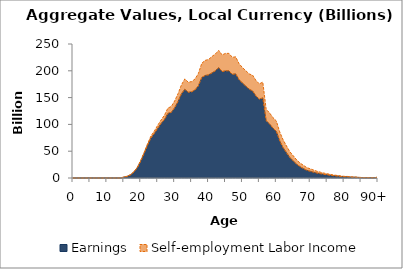
| Category | Earnings | Self-employment Labor Income |
|---|---|---|
| 0 | 0 | 0 |
|  | 0 | 0 |
| 2 | 0 | 0 |
| 3 | 0 | 0 |
| 4 | 0 | 0 |
| 5 | 0 | 0 |
| 6 | 0 | 0 |
| 7 | 0 | 0 |
| 8 | 0 | 0 |
| 9 | 0 | 0 |
| 10 | 0 | 0 |
| 11 | 0 | 0 |
| 12 | 0 | 0 |
| 13 | 0 | 0 |
| 14 | 0 | 0 |
| 15 | 1618.342 | 218.24 |
| 16 | 3059.624 | 309.433 |
| 17 | 5889.414 | 445.98 |
| 18 | 11230.916 | 643.451 |
| 19 | 19427.998 | 907.563 |
| 20 | 31693.841 | 1327.071 |
| 21 | 46060.813 | 1864.875 |
| 22 | 61195.367 | 2564.497 |
| 23 | 74717.393 | 3521.505 |
| 24 | 82914.275 | 4682.553 |
| 25 | 92669.138 | 5724.425 |
| 26 | 101815.867 | 6456.386 |
| 27 | 109250.815 | 8007.313 |
| 28 | 120593.2 | 9794.211 |
| 29 | 122427.278 | 10993.155 |
| 30 | 131002.43 | 12770.02 |
| 31 | 142847.174 | 14493.1 |
| 32 | 157217.451 | 16555.685 |
| 33 | 165664.427 | 19235.634 |
| 34 | 159937.778 | 18837.987 |
| 35 | 160653.683 | 19165.708 |
| 36 | 164166.934 | 20488.446 |
| 37 | 171979.604 | 22964.89 |
| 38 | 187545.929 | 26499.419 |
| 39 | 191251.602 | 28178.516 |
| 40 | 192373.236 | 28723.092 |
| 41 | 195984.248 | 30610.496 |
| 42 | 199903.014 | 31474.63 |
| 43 | 206010.977 | 32010.897 |
| 44 | 198551.921 | 31113.857 |
| 45 | 199830.768 | 32638.922 |
| 46 | 200021.409 | 32498.626 |
| 47 | 193367.714 | 31888.043 |
| 48 | 194332.802 | 31678.583 |
| 49 | 183491.693 | 29798.911 |
| 50 | 177111.476 | 28960.317 |
| 51 | 171421.255 | 28699.985 |
| 52 | 165705.131 | 28456.369 |
| 53 | 162338.494 | 29378.35 |
| 54 | 152877.015 | 29010.795 |
| 55 | 146960.652 | 28627.605 |
| 56 | 149471.912 | 29479.679 |
| 57 | 106850.737 | 21305.702 |
| 58 | 100864.652 | 20649.227 |
| 59 | 93059.924 | 19578.811 |
| 60 | 87096.947 | 19359.068 |
| 61 | 69318.752 | 16590.511 |
| 62 | 56595.117 | 14600.062 |
| 63 | 47340.378 | 12437.438 |
| 64 | 37965.557 | 11044.531 |
| 65 | 31903.446 | 9500.255 |
| 66 | 25730.141 | 8028.818 |
| 67 | 21108.636 | 6782.199 |
| 68 | 17584.874 | 6104.28 |
| 69 | 14284.533 | 5103.904 |
| 70 | 12574.257 | 4555.48 |
| 71 | 10764.903 | 4041.687 |
| 72 | 9163.89 | 3366.348 |
| 73 | 7939.662 | 2906.111 |
| 74 | 6799.833 | 2414.391 |
| 75 | 5934.416 | 2036.923 |
| 76 | 4981.722 | 1677.109 |
| 77 | 4166.59 | 1361.6 |
| 78 | 3584.055 | 1136.925 |
| 79 | 2959.644 | 911.368 |
| 80 | 2386.856 | 702.231 |
| 81 | 2343.478 | 554.282 |
| 82 | 1555.221 | 470.241 |
| 83 | 1429.188 | 428.203 |
| 84 | 1110.903 | 313.863 |
| 85 | 765.379 | 254.739 |
| 86 | 576.703 | 191.848 |
| 87 | 619.464 | 146.48 |
| 88 | 522.892 | 113.539 |
| 89 | 422.996 | 84.37 |
| 90+ | 1519.26 | 278.273 |